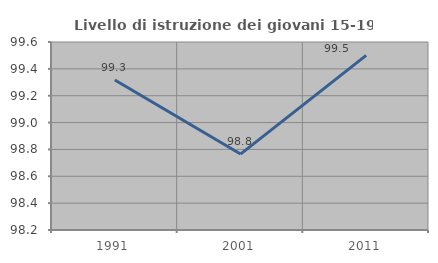
| Category | Livello di istruzione dei giovani 15-19 anni |
|---|---|
| 1991.0 | 99.317 |
| 2001.0 | 98.765 |
| 2011.0 | 99.5 |